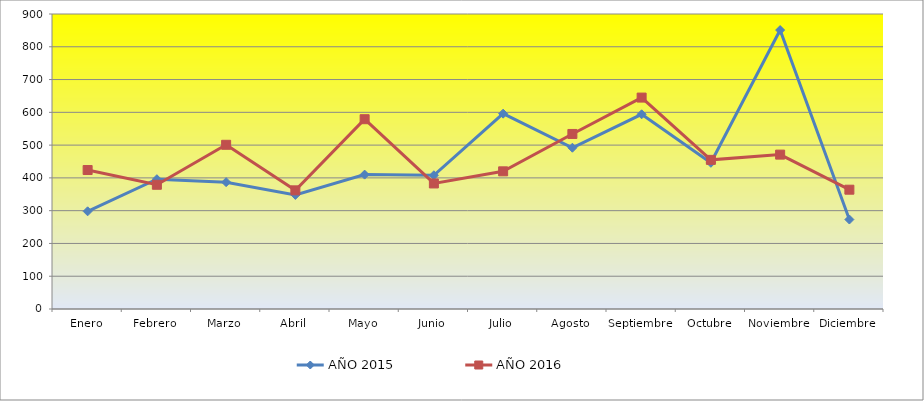
| Category | AÑO 2015 | AÑO 2016 |
|---|---|---|
| Enero | 298 | 424 |
| Febrero | 396 | 379 |
| Marzo | 387 | 501 |
| Abril | 348 | 362 |
| Mayo | 410 | 579 |
| Junio | 408 | 383 |
| Julio | 596 | 420 |
| Agosto | 492 | 534 |
| Septiembre | 594 | 645 |
| Octubre | 446 | 455 |
| Noviembre | 851 | 471 |
| Diciembre | 273 | 364 |